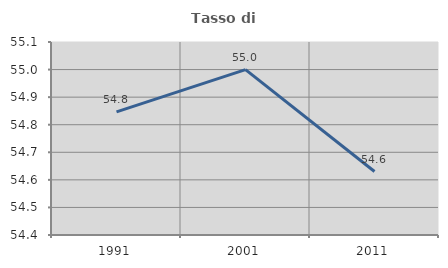
| Category | Tasso di occupazione   |
|---|---|
| 1991.0 | 54.847 |
| 2001.0 | 55 |
| 2011.0 | 54.63 |